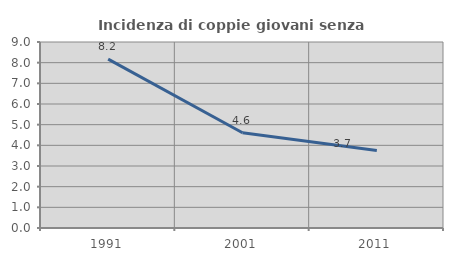
| Category | Incidenza di coppie giovani senza figli |
|---|---|
| 1991.0 | 8.173 |
| 2001.0 | 4.608 |
| 2011.0 | 3.746 |